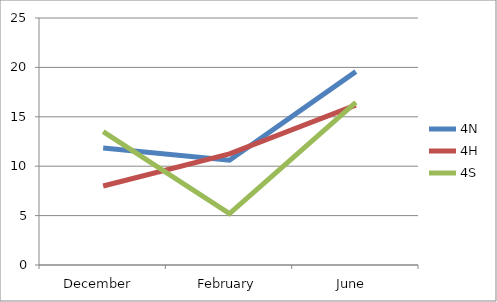
| Category | 4N | 4H | 4S |
|---|---|---|---|
| December  | 11.846 | 8 | 13.5 |
| February | 10.6 | 11.25 | 5.2 |
| June  | 19.577 | 16.182 | 16.469 |